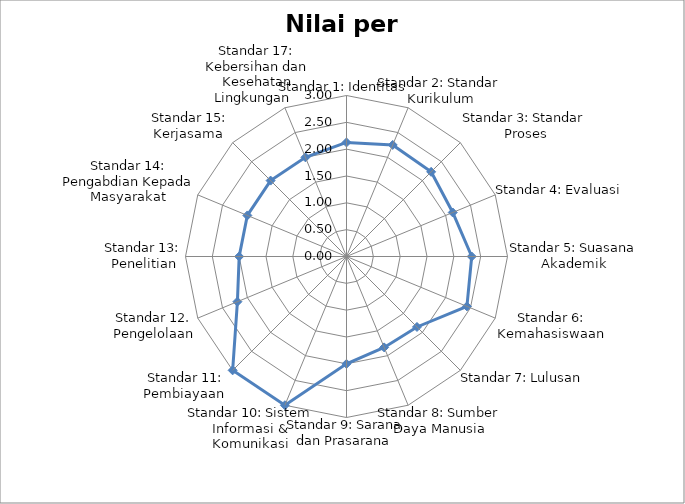
| Category | Nilai per standar |
|---|---|
| Standar 1: Identitas | 2.125 |
| Standar 2: Standar Kurikulum | 2.25 |
| Standar 3: Standar Proses | 2.231 |
| Standar 4: Evaluasi | 2.143 |
| Standar 5: Suasana Akademik | 2.333 |
| Standar 6: Kemahasiswaan | 2.429 |
| Standar 7: Lulusan  | 1.857 |
| Standar 8: Sumber Daya Manusia | 1.833 |
| Standar 9: Sarana dan Prasarana  | 2 |
| Standar 10: Sistem Informasi & Komunikasi | 3 |
| Standar 11: Pembiayaan  | 3 |
| Standar 12. Pengelolaan | 2.2 |
| Standar 13: Penelitian | 2 |
| Standar 14: Pengabdian Kepada Masyarakat | 2 |
| Standar 15: Kerjasama  | 2 |
| Standar 17: Kebersihan dan Kesehatan Lingkungan   | 2 |